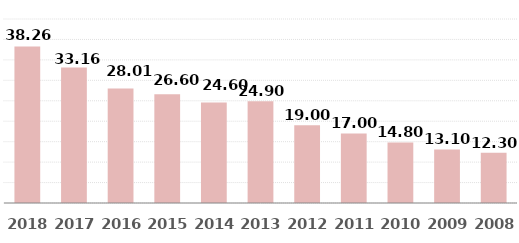
| Category | Series 2 |
|---|---|
| 2018.0 | 38.26 |
| 2017.0 | 33.16 |
| 2016.0 | 28.01 |
| 2015.0 | 26.6 |
| 2014.0 | 24.6 |
| 2013.0 | 24.9 |
| 2012.0 | 19 |
| 2011.0 | 17 |
| 2010.0 | 14.8 |
| 2009.0 | 13.1 |
| 2008.0 | 12.3 |